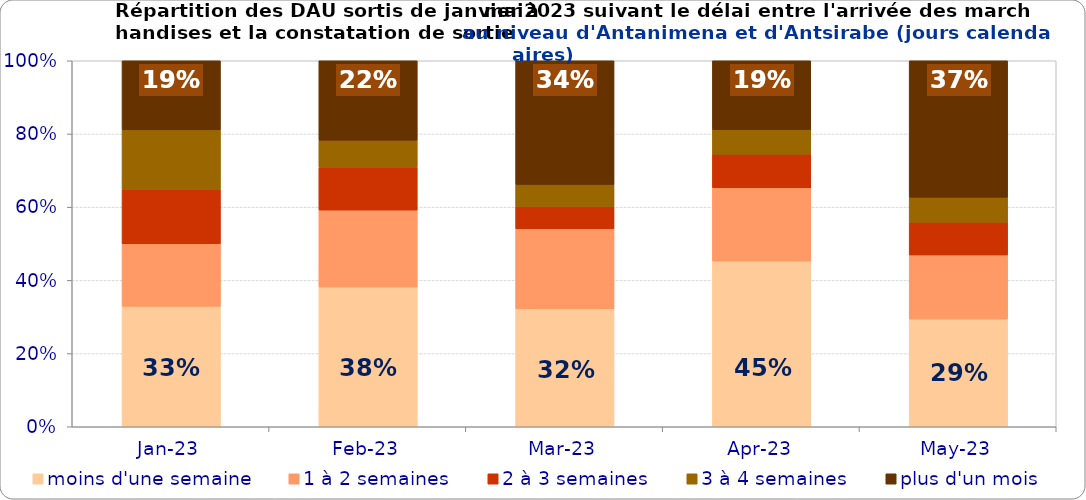
| Category | moins d'une semaine | 1 à 2 semaines | 2 à 3 semaines | 3 à 4 semaines | plus d'un mois |
|---|---|---|---|---|---|
| 2023-01-01 | 0.329 | 0.171 | 0.148 | 0.164 | 0.189 |
| 2023-02-01 | 0.382 | 0.21 | 0.116 | 0.075 | 0.217 |
| 2023-03-01 | 0.322 | 0.218 | 0.061 | 0.06 | 0.338 |
| 2023-04-01 | 0.453 | 0.2 | 0.092 | 0.067 | 0.188 |
| 2023-05-01 | 0.294 | 0.175 | 0.089 | 0.069 | 0.373 |